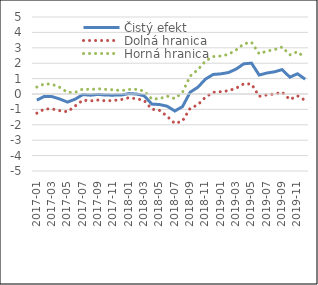
| Category | Čistý efekt | Dolná hranica | Horná hranica |
|---|---|---|---|
| 2017-01 | -0.399 | -1.246 | 0.448 |
| 2017-02 | -0.154 | -0.97 | 0.663 |
| 2017-03 | -0.172 | -0.973 | 0.629 |
| 2017-04 | -0.327 | -1.082 | 0.427 |
| 2017-05 | -0.526 | -1.152 | 0.101 |
| 2017-06 | -0.337 | -0.78 | 0.107 |
| 2017-07 | -0.038 | -0.398 | 0.323 |
| 2017-08 | -0.079 | -0.447 | 0.29 |
| 2017-09 | -0.026 | -0.392 | 0.341 |
| 2017-10 | -0.073 | -0.445 | 0.299 |
| 2017-11 | -0.073 | -0.42 | 0.273 |
| 2017-12 | -0.07 | -0.361 | 0.22 |
| 2018-01 | 0.027 | -0.244 | 0.298 |
| 2018-02 | -0.002 | -0.308 | 0.305 |
| 2018-03 | -0.116 | -0.42 | 0.188 |
| 2018-04 | -0.655 | -0.985 | -0.324 |
| 2018-05 | -0.684 | -1.061 | -0.306 |
| 2018-06 | -0.794 | -1.449 | -0.138 |
| 2018-07 | -1.105 | -1.914 | -0.296 |
| 2018-08 | -0.821 | -1.755 | 0.113 |
| 2018-09 | 0.117 | -0.93 | 1.164 |
| 2018-10 | 0.437 | -0.702 | 1.577 |
| 2018-11 | 0.968 | -0.208 | 2.144 |
| 2018-12 | 1.27 | 0.108 | 2.431 |
| 2019-01 | 1.308 | 0.15 | 2.466 |
| 2019-02 | 1.395 | 0.214 | 2.576 |
| 2019-03 | 1.621 | 0.377 | 2.865 |
| 2019-04 | 1.96 | 0.661 | 3.259 |
| 2019-05 | 2.004 | 0.647 | 3.361 |
| 2019-06 | 1.231 | -0.152 | 2.613 |
| 2019-07 | 1.363 | -0.059 | 2.785 |
| 2019-08 | 1.441 | 0.002 | 2.881 |
| 2019-09 | 1.584 | 0.116 | 3.052 |
| 2019-10 | 1.092 | -0.359 | 2.543 |
| 2019-11 | 1.313 | -0.12 | 2.746 |
| 2019-12 | 0.961 | -0.414 | 2.335 |